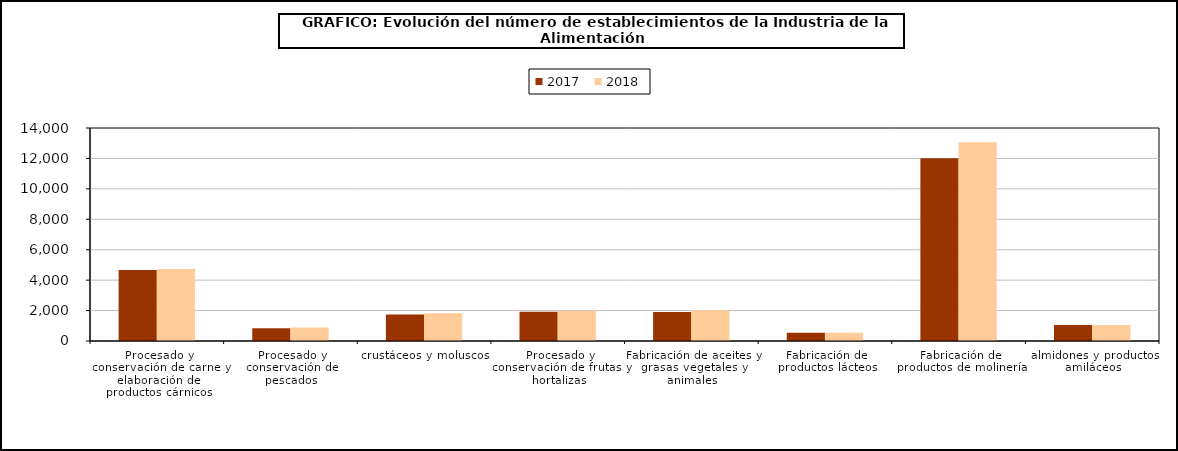
| Category | 2017 | 2018 |
|---|---|---|
| 0 | 4673 | 4727 |
| 1 | 840 | 884 |
| 2 | 1748 | 1821 |
| 3 | 1922 | 1995 |
| 4 | 1900 | 2020 |
| 5 | 546 | 546 |
| 6 | 12007 | 13065 |
| 7 | 1048 | 1045 |